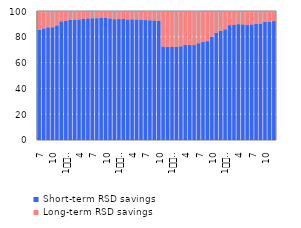
| Category | Short-term RSD savings | Long-term RSD savings |
|---|---|---|
| 7 | 85.44 | 14.56 |
| 8 | 86.467 | 13.533 |
| 9 | 87.282 | 12.718 |
| 10 | 87.377 | 12.623 |
| 11 | 88.789 | 11.211 |
| 12 | 92 | 8 |
| 1
2009 | 92.392 | 7.608 |
| 2 | 93.019 | 6.981 |
| 3 | 93.095 | 6.905 |
| 4 | 93.444 | 6.556 |
| 5 | 93.851 | 6.149 |
| 6 | 94.233 | 5.767 |
| 7 | 94.364 | 5.636 |
| 8 | 94.406 | 5.594 |
| 9 | 94.872 | 5.128 |
| 10 | 94.872 | 5.128 |
| 11 | 94.284 | 5.716 |
| 12 | 93.653 | 6.347 |
| 1
2010 | 93.743 | 6.257 |
| 2 | 93.78 | 6.22 |
| 3 | 93.471 | 6.529 |
| 4 | 93.509 | 6.491 |
| 5 | 93.447 | 6.553 |
| 6 | 93.232 | 6.768 |
| 7 | 92.987 | 7.013 |
| 8 | 92.86 | 7.14 |
| 9 | 92.663 | 7.337 |
| 10 | 92.447 | 7.553 |
| 11 | 72.411 | 27.589 |
| 12 | 72.29 | 27.71 |
| 1
2011 | 72.103 | 27.897 |
| 2 | 72.162 | 27.838 |
| 3 | 72.606 | 27.394 |
| 4 | 73.825 | 26.175 |
| 5 | 73.812 | 26.188 |
| 6 | 73.583 | 26.417 |
| 7 | 74.981 | 25.019 |
| 8 | 76.028 | 23.972 |
| 9 | 76.633 | 23.367 |
| 10 | 79.825 | 20.175 |
| 11 | 83.163 | 16.837 |
| 12 | 84.479 | 15.521 |
| 1
2012 | 85.78 | 14.22 |
| 2 | 89.025 | 10.975 |
| 3 | 89.187 | 10.813 |
| 4 | 89.787 | 10.213 |
| 5 | 89.594 | 10.406 |
| 6 | 89.092 | 10.908 |
| 7 | 89.59 | 10.41 |
| 8 | 90.008 | 9.992 |
| 9 | 90.211 | 9.789 |
| 10 | 91.695 | 8.305 |
| 11 | 91.745 | 8.255 |
| 12 | 92.207 | 7.793 |